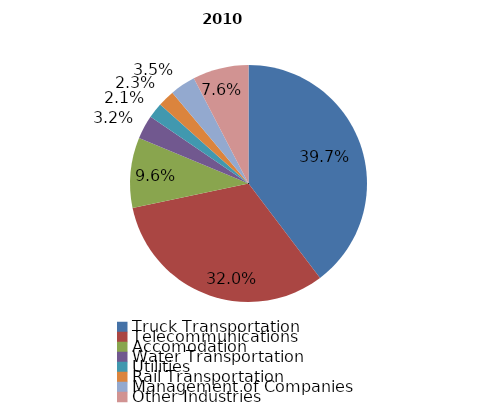
| Category | 2010 |
|---|---|
| Truck Transportation | 1222 |
| Telecommunications | 985 |
| Accomodation | 295 |
| Water Transportation | 100 |
| Utilities | 65 |
| Rail Transportation | 70 |
| Management of Companies | 107 |
| Other Industries | 235 |